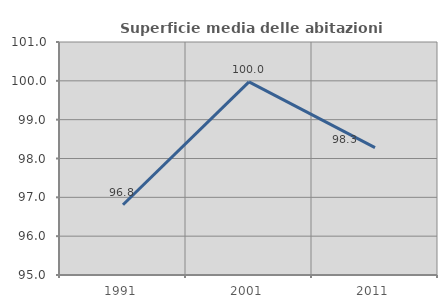
| Category | Superficie media delle abitazioni occupate |
|---|---|
| 1991.0 | 96.808 |
| 2001.0 | 99.972 |
| 2011.0 | 98.281 |